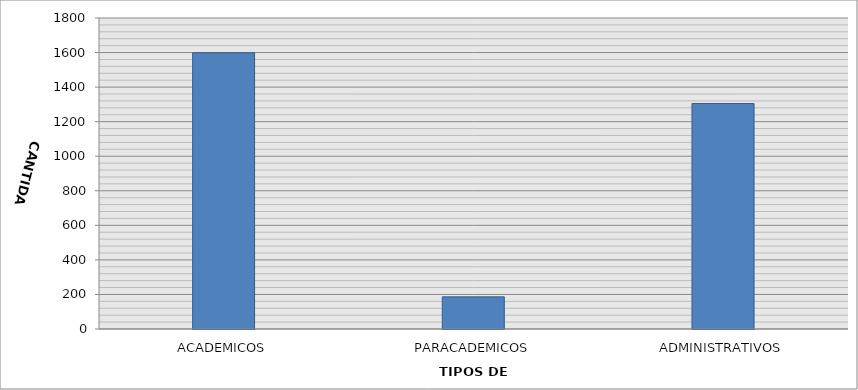
| Category | CANTIDAD |
|---|---|
| ACADEMICOS | 1599 |
| PARACADEMICOS | 186 |
| ADMINISTRATIVOS | 1305 |